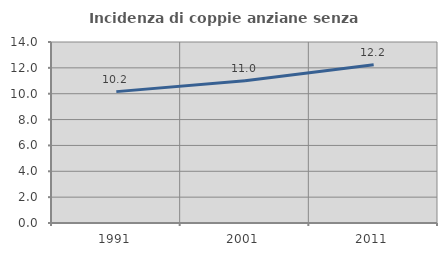
| Category | Incidenza di coppie anziane senza figli  |
|---|---|
| 1991.0 | 10.161 |
| 2001.0 | 10.995 |
| 2011.0 | 12.246 |